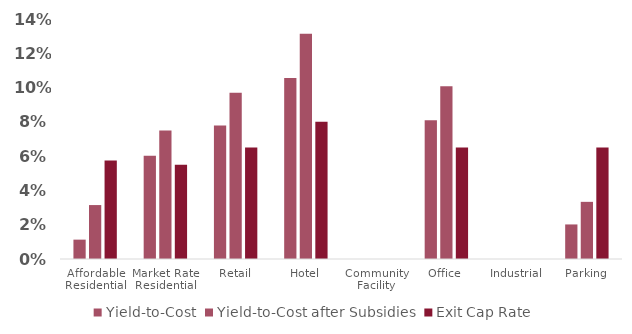
| Category | Yield-to-Cost | Yield-to-Cost after Subsidies | Exit Cap Rate |
|---|---|---|---|
| Affordable Residential | 0.011 | 0.031 | 0.058 |
| Market Rate Residential | 0.06 | 0.075 | 0.055 |
| Retail | 0.078 | 0.097 | 0.065 |
| Hotel | 0.106 | 0.131 | 0.08 |
| Community Facility | 0 | 0 | 0 |
| Office | 0.081 | 0.101 | 0.065 |
| Industrial | 0 | 0 | 0 |
| Parking | 0.02 | 0.033 | 0.065 |